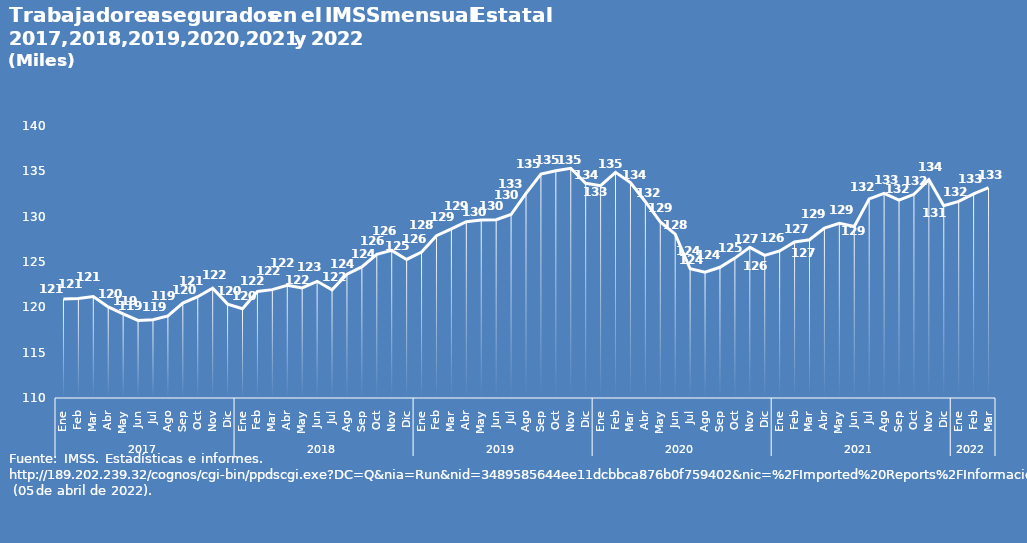
| Category | Series 0 |
|---|---|
| 0 | 120.92 |
| 1 | 120.967 |
| 2 | 121.191 |
| 3 | 120.043 |
| 4 | 119.289 |
| 5 | 118.551 |
| 6 | 118.643 |
| 7 | 119.047 |
| 8 | 120.465 |
| 9 | 121.173 |
| 10 | 122.112 |
| 11 | 120.356 |
| 12 | 119.843 |
| 13 | 121.757 |
| 14 | 121.952 |
| 15 | 122.435 |
| 16 | 122.144 |
| 17 | 122.869 |
| 18 | 121.922 |
| 19 | 123.648 |
| 20 | 124.462 |
| 21 | 125.851 |
| 22 | 126.284 |
| 23 | 125.28 |
| 24 | 126.094 |
| 25 | 127.906 |
| 26 | 128.648 |
| 27 | 129.443 |
| 28 | 129.621 |
| 29 | 129.67 |
| 30 | 130.235 |
| 31 | 132.569 |
| 32 | 134.703 |
| 33 | 135.068 |
| 34 | 135.341 |
| 35 | 133.675 |
| 36 | 133.413 |
| 37 | 134.89 |
| 38 | 133.756 |
| 39 | 131.649 |
| 40 | 129.425 |
| 41 | 128.074 |
| 42 | 124.251 |
| 43 | 123.878 |
| 44 | 124.417 |
| 45 | 125.428 |
| 46 | 126.613 |
| 47 | 125.731 |
| 48 | 126.216 |
| 49 | 127.199 |
| 50 | 127.45 |
| 51 | 128.729 |
| 52 | 129.262 |
| 53 | 128.911 |
| 54 | 131.962 |
| 55 | 132.574 |
| 56 | 131.815 |
| 57 | 132.469 |
| 58 | 134.083 |
| 59 | 131.218 |
| 60 | 131.69 |
| 61 | 132.523 |
| 62 | 133.197 |